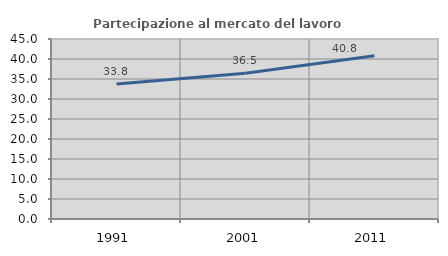
| Category | Partecipazione al mercato del lavoro  femminile |
|---|---|
| 1991.0 | 33.762 |
| 2001.0 | 36.457 |
| 2011.0 | 40.825 |